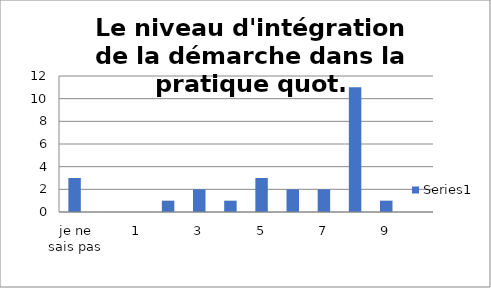
| Category | Series 0 |
|---|---|
| je ne sais pas | 3 |
| 0 | 0 |
| 1 | 0 |
| 2 | 1 |
| 3 | 2 |
| 4 | 1 |
| 5 | 3 |
| 6 | 2 |
| 7 | 2 |
| 8 | 11 |
| 9 | 1 |
| 10 | 0 |